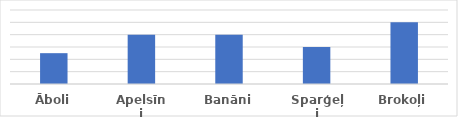
| Category | Apjoms |
|---|---|
| Āboli | 500 |
| Apelsīni | 800 |
| Banāni | 800 |
| Sparģeļi | 600 |
| Brokoļi | 1000 |